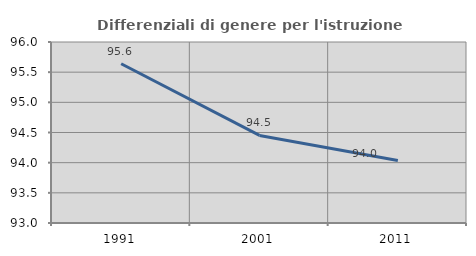
| Category | Differenziali di genere per l'istruzione superiore |
|---|---|
| 1991.0 | 95.64 |
| 2001.0 | 94.452 |
| 2011.0 | 94.035 |